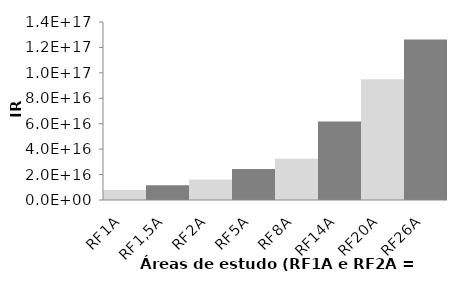
| Category | Series 0 |
|---|---|
| RF1A | 7963137090655123 |
| RF1,5A | 11530191623623440 |
| RF2A | 16181770314382266 |
| RF5A | 24299130893630016 |
| RF8A | 32507879347126248 |
| RF14A | 61694122667938120 |
| RF20A | 94999164415412656 |
| RF26A | 126261276614803248 |